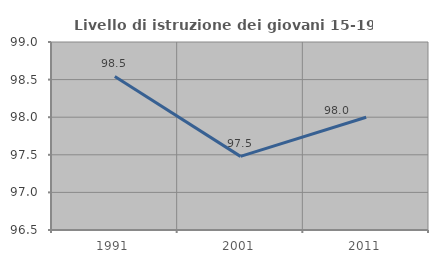
| Category | Livello di istruzione dei giovani 15-19 anni |
|---|---|
| 1991.0 | 98.542 |
| 2001.0 | 97.479 |
| 2011.0 | 98 |